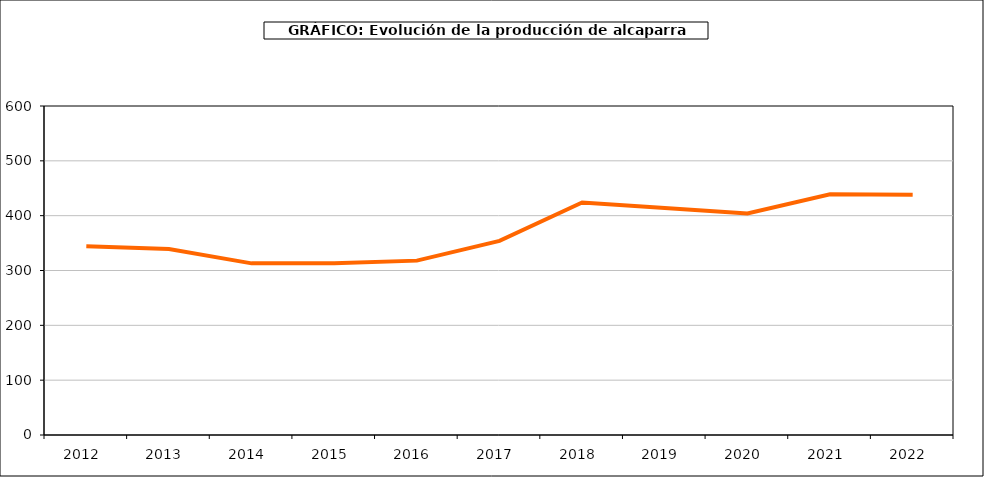
| Category | producción |
|---|---|
| 2012.0 | 344 |
| 2013.0 | 339 |
| 2014.0 | 313 |
| 2015.0 | 313 |
| 2016.0 | 318 |
| 2017.0 | 354 |
| 2018.0 | 424 |
| 2019.0 | 414 |
| 2020.0 | 404 |
| 2021.0 | 439 |
| 2022.0 | 438 |